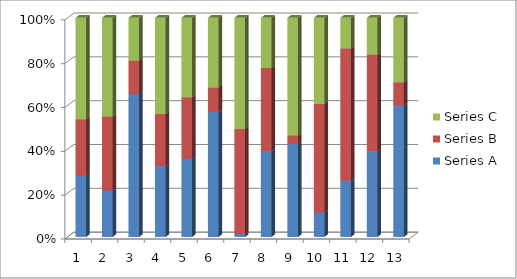
| Category | Series A | Series B | Series C |
|---|---|---|---|
| 0 | 435 | 403 | 722 |
| 1 | 347 | 556 | 740 |
| 2 | 756 | 176 | 227 |
| 3 | 320 | 236 | 435 |
| 4 | 654 | 514 | 664 |
| 5 | 825 | 162 | 459 |
| 6 | 18 | 637 | 675 |
| 7 | 125 | 121 | 73 |
| 8 | 668 | 61 | 845 |
| 9 | 69 | 310 | 246 |
| 10 | 343 | 806 | 187 |
| 11 | 489 | 552 | 212 |
| 12 | 758 | 134 | 372 |